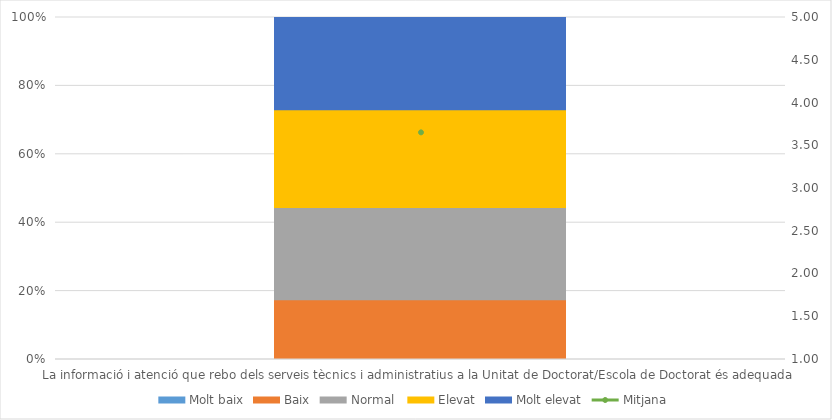
| Category | Molt baix | Baix | Normal  | Elevat | Molt elevat |
|---|---|---|---|---|---|
| La informació i atenció que rebo dels serveis tècnics i administratius a la Unitat de Doctorat/Escola de Doctorat és adequada | 0 | 11 | 17 | 18 | 17 |